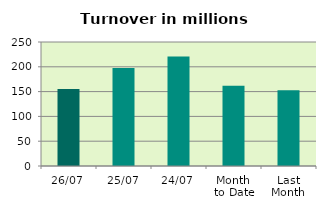
| Category | Series 0 |
|---|---|
| 26/07 | 155.304 |
| 25/07 | 197.512 |
| 24/07 | 220.872 |
| Month 
to Date | 161.964 |
| Last
Month | 152.535 |